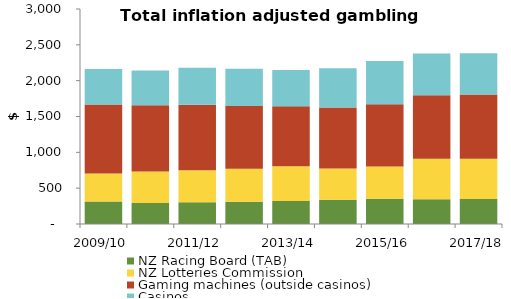
| Category | NZ Racing Board (TAB) | NZ Lotteries Commission | Gaming machines (outside casinos) | Casinos |
|---|---|---|---|---|
| 2009/10 | 314.584 | 391.683 | 959.554 | 496.968 |
| 2010/11 | 294.616 | 436.835 | 924.587 | 484.203 |
| 2011/12 | 302.758 | 448.051 | 913.731 | 516.449 |
| 2012/13 | 311.942 | 457.733 | 876.386 | 518.948 |
| 2013/14 | 322.578 | 481.582 | 838.522 | 505.081 |
| 2014/15 | 338.053 | 437.192 | 850.838 | 548.188 |
| 2015/16 | 352.56 | 450.38 | 868.788 | 603.19 |
| 2016/17 | 344.49 | 565.744 | 887.309 | 582.999 |
| 2017/18 | 349.868 | 560.611 | 894.936 | 577.899 |